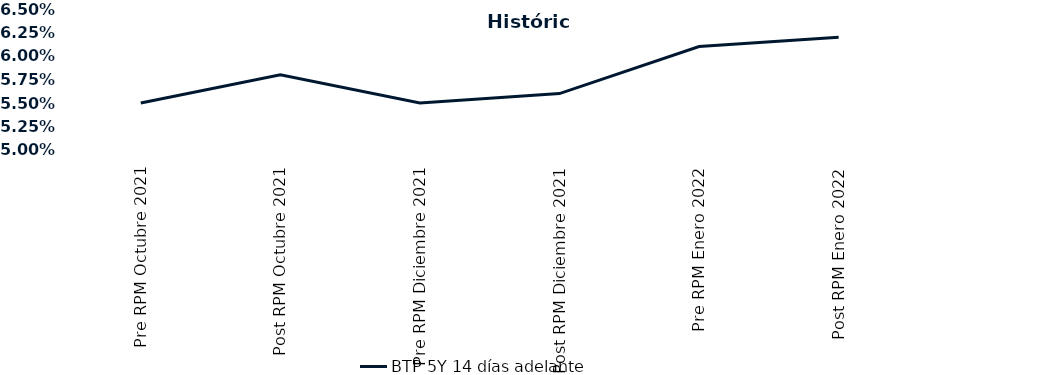
| Category | BTP 5Y 14 días adelante |
|---|---|
| Pre RPM Octubre 2021 | 0.055 |
| Post RPM Octubre 2021 | 0.058 |
| Pre RPM Diciembre 2021 | 0.055 |
| Post RPM Diciembre 2021 | 0.056 |
| Pre RPM Enero 2022 | 0.061 |
| Post RPM Enero 2022 | 0.062 |